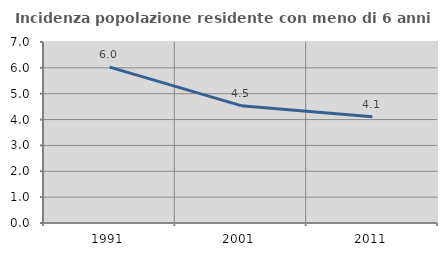
| Category | Incidenza popolazione residente con meno di 6 anni |
|---|---|
| 1991.0 | 6.029 |
| 2001.0 | 4.539 |
| 2011.0 | 4.114 |